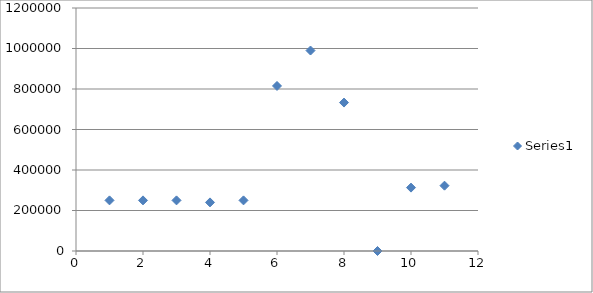
| Category | Series 0 |
|---|---|
| 0 | 250000 |
| 1 | 250000 |
| 2 | 250000 |
| 3 | 240000 |
| 4 | 250000 |
| 5 | 815000 |
| 6 | 990000 |
| 7 | 733000 |
| 8 | 0 |
| 9 | 313000 |
| 10 | 322575 |